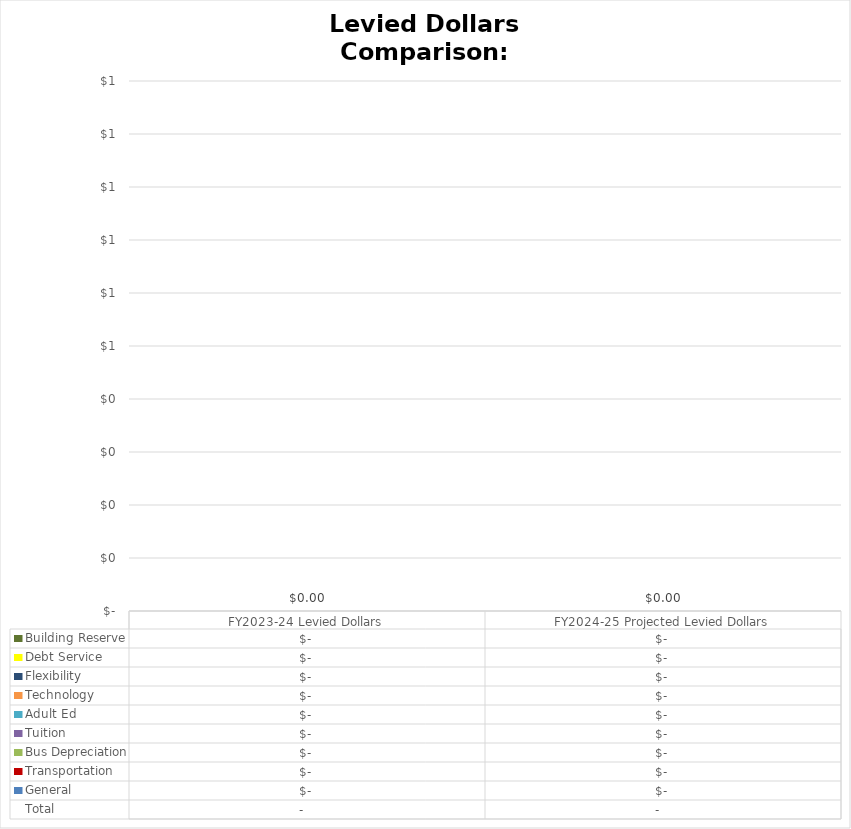
| Category |  General  |  Transportation  |  Bus Depreciation  |  Tuition  |  Adult Ed  |  Technology  |  Flexibility  |  Debt Service  |  Building Reserve  |
|---|---|---|---|---|---|---|---|---|---|
| FY2023-24 Levied Dollars | 0 | 0 | 0 | 0 | 0 | 0 | 0 | 0 | 0 |
|  FY2024-25 Projected Levied Dollars  | 0 | 0 | 0 | 0 | 0 | 0 | 0 | 0 | 0 |